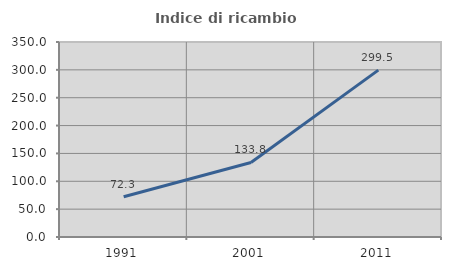
| Category | Indice di ricambio occupazionale  |
|---|---|
| 1991.0 | 72.259 |
| 2001.0 | 133.756 |
| 2011.0 | 299.535 |